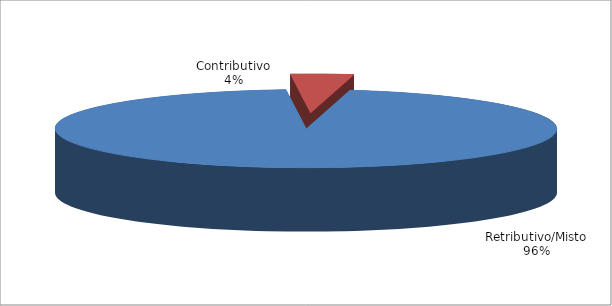
| Category | Series 1 |
|---|---|
| Retributivo/Misto | 19195 |
| Contributivo | 811 |